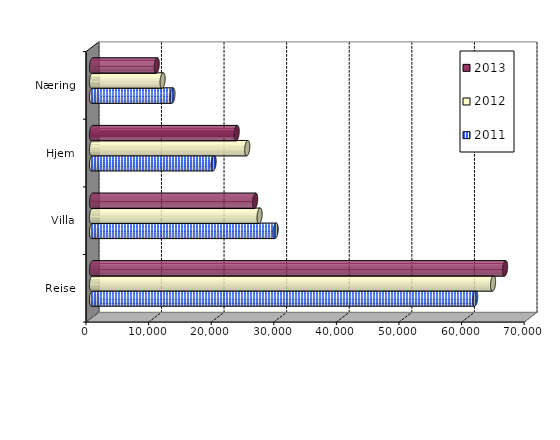
| Category | 2011 | 2012 | 2013 |
|---|---|---|---|
| Reise | 61217.966 | 64072.417 | 65994.352 |
| Villa | 29339.686 | 26771.16 | 26063.869 |
| Hjem | 19430.909 | 24800.057 | 23110.983 |
| Næring | 12853.48 | 11277.262 | 10340.01 |